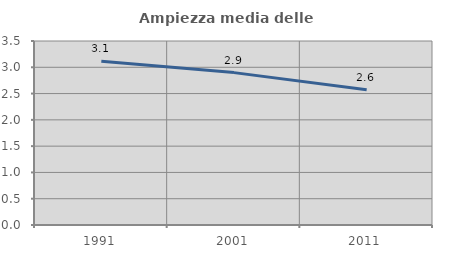
| Category | Ampiezza media delle famiglie |
|---|---|
| 1991.0 | 3.115 |
| 2001.0 | 2.899 |
| 2011.0 | 2.573 |